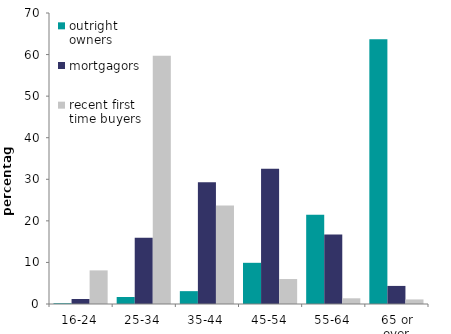
| Category | outright owners | mortgagors | recent first time buyers |
|---|---|---|---|
| 16-24 | 0.18 | 1.199 | 8.086 |
| 25-34 | 1.678 | 15.924 | 59.724 |
| 35-44 | 3.091 | 29.295 | 23.713 |
| 45-54 | 9.908 | 32.523 | 6.005 |
| 55-64 | 21.463 | 16.702 | 1.373 |
| 65 or over | 63.679 | 4.348 | 1.099 |